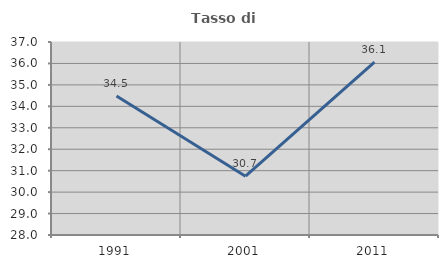
| Category | Tasso di occupazione   |
|---|---|
| 1991.0 | 34.483 |
| 2001.0 | 30.744 |
| 2011.0 | 36.067 |